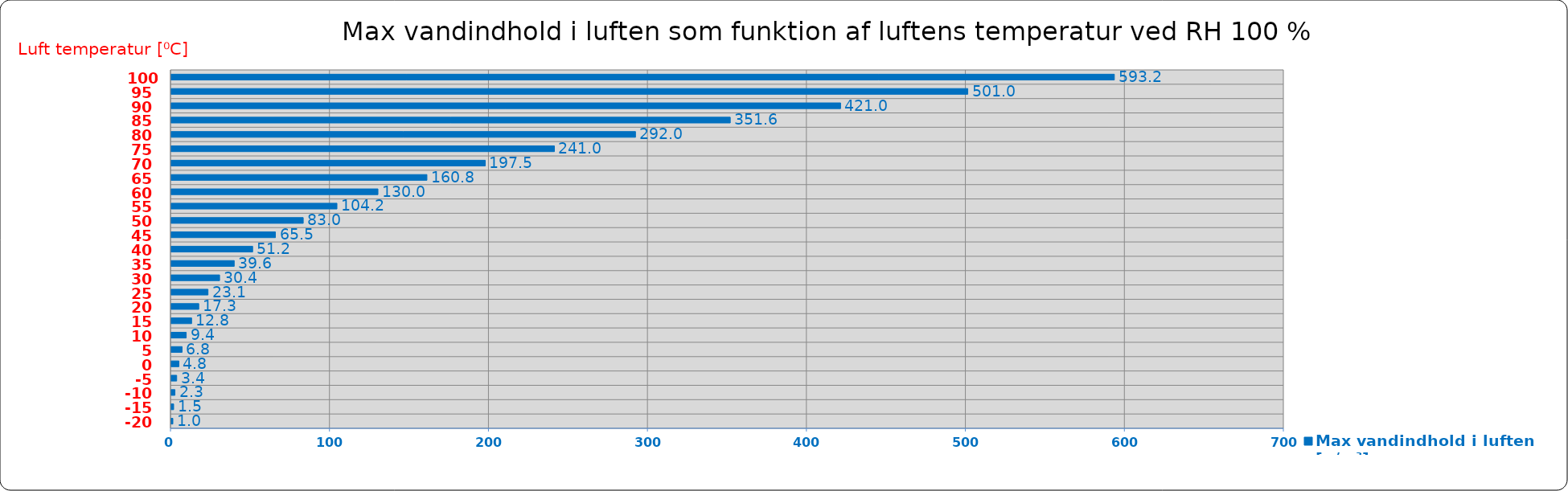
| Category | Max vandindhold i luften [g/m³] |
|---|---|
| -20.0 | 1 |
| -15.0 | 1.5 |
| -10.0 | 2.3 |
| -5.0 | 3.4 |
| 0.0 | 4.8 |
| 5.0 | 6.8 |
| 10.0 | 9.4 |
| 15.0 | 12.8 |
| 20.0 | 17.3 |
| 25.0 | 23.1 |
| 30.0 | 30.4 |
| 35.0 | 39.6 |
| 40.0 | 51.2 |
| 45.0 | 65.5 |
| 50.0 | 83 |
| 55.0 | 104.2 |
| 60.0 | 130 |
| 65.0 | 160.8 |
| 70.0 | 197.5 |
| 75.0 | 241 |
| 80.0 | 292 |
| 85.0 | 351.6 |
| 90.0 | 421 |
| 95.0 | 501 |
| 100.0 | 593.2 |